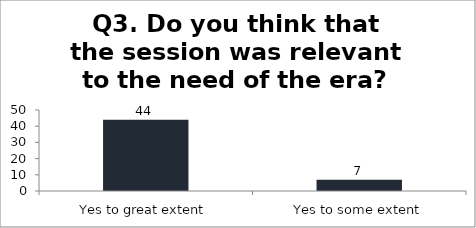
| Category | Q3. Do you think that the session was relevant to the need of the era? |
|---|---|
| Yes to great extent | 44 |
| Yes to some extent | 7 |